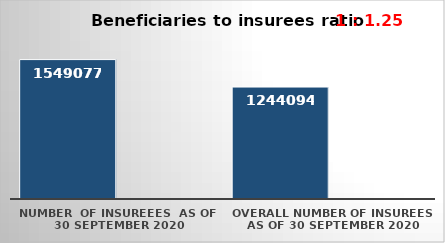
| Category | Series 0 | Series 1 |
|---|---|---|
| NUMBER  of insureees  as of  30 September 2020 | 1549077 |  |
| OVERALL number of insurees as of 30 September 2020 | 1244094 |  |